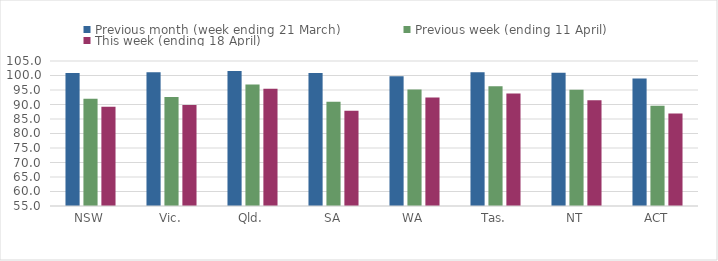
| Category | Previous month (week ending 21 March) | Previous week (ending 11 April) | This week (ending 18 April) |
|---|---|---|---|
| NSW | 100.819 | 92.026 | 89.25 |
| Vic. | 101.137 | 92.616 | 89.83 |
| Qld. | 101.525 | 96.904 | 95.472 |
| SA | 100.869 | 90.944 | 87.884 |
| WA | 99.711 | 95.163 | 92.395 |
| Tas. | 101.085 | 96.271 | 93.826 |
| NT | 100.943 | 95.047 | 91.493 |
| ACT | 98.958 | 89.583 | 86.891 |